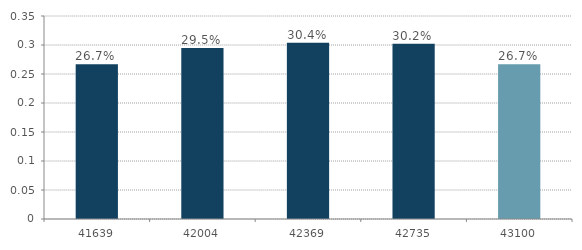
| Category | Series 0 |
|---|---|
| 41639.0 | 0.267 |
| 42004.0 | 0.295 |
| 42369.0 | 0.304 |
| 42735.0 | 0.302 |
| 43100.0 | 0.267 |